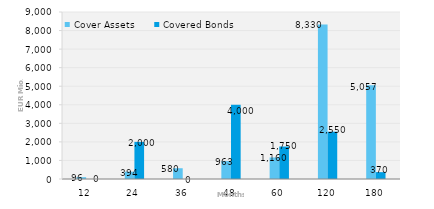
| Category | Cover Assets | Covered Bonds |
|---|---|---|
| 12.0 | 96.454 | 0 |
| 24.0 | 393.903 | 2000 |
| 36.0 | 579.994 | 0 |
| 48.0 | 962.81 | 4000 |
| 60.0 | 1160.412 | 1750 |
| 120.0 | 8329.81 | 2550 |
| 180.0 | 5057.014 | 370 |